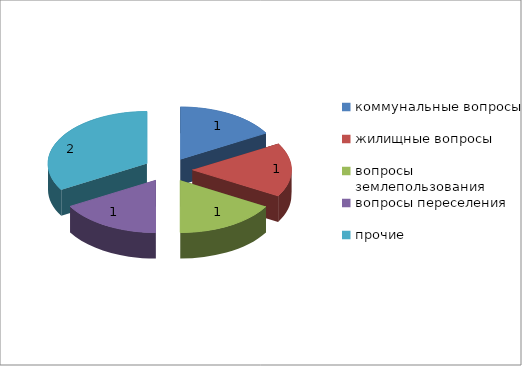
| Category | Series 0 |
|---|---|
| коммунальные вопросы | 1 |
| жилищные вопросы | 1 |
| вопросы землепользования | 1 |
| вопросы переселения | 1 |
| прочие | 2 |